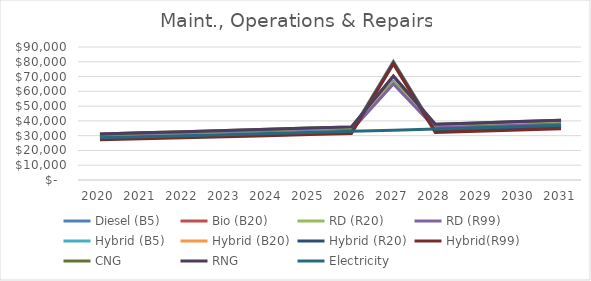
| Category | Diesel (B5) | Bio (B20) | RD (R20) | RD (R99) | Hybrid (B5) | Hybrid (B20) | Hybrid (R20) | Hybrid(R99) | CNG | RNG | Electricity |
|---|---|---|---|---|---|---|---|---|---|---|---|
| 2020.0 | 30720 | 30412.8 | 30105.6 | 29184 | 28800 | 28500 | 28200 | 27300 | 31180.8 | 31180.8 | 28569.6 |
| 2021.0 | 31457.28 | 31142.707 | 30828.134 | 29884.416 | 29491.2 | 29184 | 28876.8 | 27955.2 | 31929.139 | 31929.139 | 29255.27 |
| 2022.0 | 32212.255 | 31890.132 | 31568.01 | 30601.642 | 30198.989 | 29884.416 | 29569.843 | 28626.125 | 32695.439 | 32695.439 | 29957.397 |
| 2023.0 | 32985.349 | 32655.495 | 32325.642 | 31336.081 | 30923.765 | 30601.642 | 30279.519 | 29313.152 | 33480.129 | 33480.129 | 30676.374 |
| 2024.0 | 33776.997 | 33439.227 | 33101.457 | 32088.147 | 31665.935 | 31336.081 | 31006.228 | 30016.667 | 34283.652 | 34283.652 | 31412.607 |
| 2025.0 | 34587.645 | 34241.769 | 33895.892 | 32858.263 | 32425.917 | 32088.147 | 31750.377 | 30737.067 | 35106.46 | 35106.46 | 32166.51 |
| 2026.0 | 35417.749 | 35063.571 | 34709.394 | 33646.861 | 33204.139 | 32858.263 | 32512.386 | 31474.757 | 35949.015 | 35949.015 | 32938.506 |
| 2027.0 | 66767.775 | 66405.097 | 66042.419 | 64954.386 | 80301.039 | 79946.861 | 79592.684 | 78530.151 | 70361.791 | 70361.791 | 33729.03 |
| 2028.0 | 37138.201 | 36766.819 | 36395.437 | 35281.291 | 34001.039 | 33646.861 | 33292.684 | 32230.151 | 37695.274 | 37695.274 | 34538.527 |
| 2029.0 | 38029.518 | 37649.223 | 37268.928 | 36128.042 | 34817.064 | 34454.386 | 34091.708 | 33003.675 | 38599.961 | 38599.961 | 35367.452 |
| 2030.0 | 38942.226 | 38552.804 | 38163.382 | 36995.115 | 35652.673 | 35281.291 | 34909.909 | 33795.763 | 39526.36 | 39526.36 | 36216.271 |
| 2031.0 | 39876.84 | 39478.071 | 39079.303 | 37882.998 | 36508.337 | 36128.042 | 35747.747 | 34606.861 | 40474.992 | 40474.992 | 37085.461 |